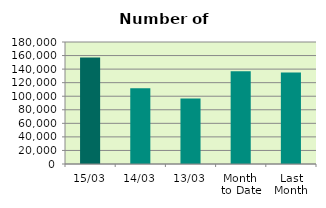
| Category | Series 0 |
|---|---|
| 15/03 | 157128 |
| 14/03 | 111592 |
| 13/03 | 96468 |
| Month 
to Date | 136999.091 |
| Last
Month | 135041.7 |